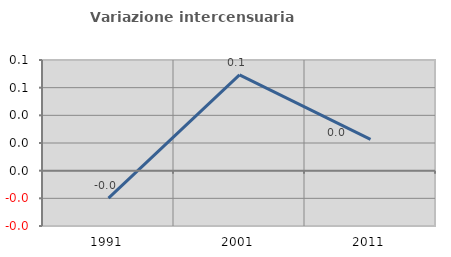
| Category | Variazione intercensuaria annua |
|---|---|
| 1991.0 | -0.02 |
| 2001.0 | 0.069 |
| 2011.0 | 0.023 |